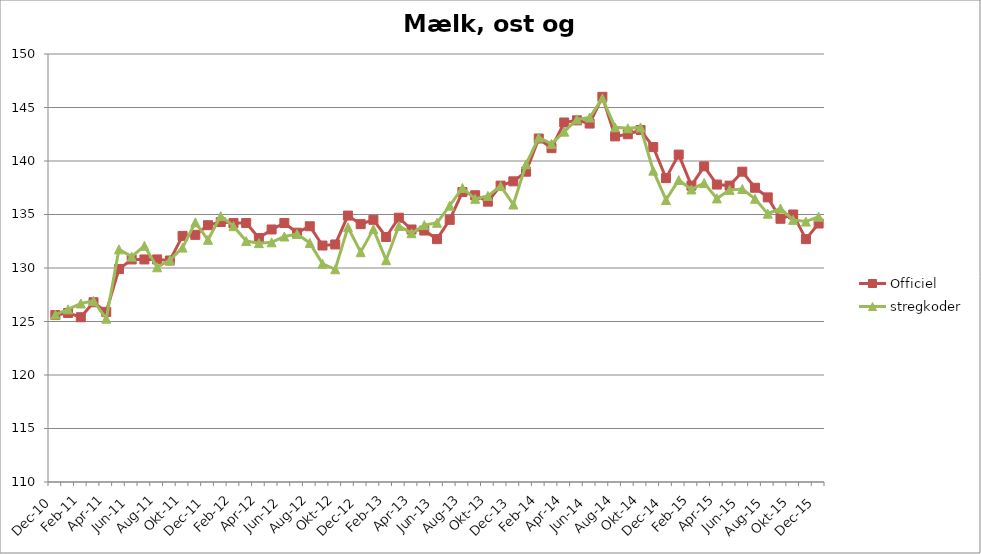
| Category | Officiel | stregkoder |
|---|---|---|
|  Dec-10 | 125.6 | 125.643 |
|  Jan-11 | 125.8 | 126.136 |
|  Feb-11 | 125.4 | 126.685 |
|  Mar-11 | 126.8 | 126.927 |
|  Apr-11 | 125.9 | 125.264 |
|  Maj-11 | 129.9 | 131.743 |
|  Jun-11 | 130.8 | 131.062 |
|  Jul-11 | 130.8 | 132.075 |
|  Aug-11 | 130.8 | 130.069 |
|  Sep-11 | 130.7 | 130.737 |
|  Okt-11 | 133 | 131.905 |
|  Nov-11 | 133.1 | 134.265 |
|  Dec-11 | 134 | 132.633 |
|  Jan-12 | 134.3 | 134.849 |
|  Feb-12 | 134.2 | 133.908 |
|  Mar-12 | 134.2 | 132.518 |
|  Apr-12 | 132.8 | 132.323 |
|  Maj-12 | 133.6 | 132.4 |
|  Jun-12 | 134.2 | 132.946 |
|  Jul-12 | 133.3 | 133.175 |
|  Aug-12 | 133.9 | 132.344 |
|  Sep-12 | 132.1 | 130.395 |
|  Okt-12 | 132.2 | 129.881 |
|  Nov-12 | 134.9 | 133.81 |
|  Dec-12 | 134.1 | 131.479 |
|  Jan-13 | 134.5 | 133.636 |
|  Feb-13 | 132.9 | 130.733 |
|  Mar-13 | 134.7 | 133.929 |
|  Apr-13 | 133.6 | 133.255 |
|  Maj-13 | 133.5 | 134.009 |
|  Jun-13 | 132.7 | 134.226 |
|  Jul-13 | 134.5 | 135.829 |
|  Aug-13 | 137.1 | 137.479 |
|  Sep-13 | 136.8 | 136.466 |
|  Okt-13 | 136.2 | 136.736 |
|  Nov-13 | 137.7 | 137.662 |
|  Dec-13 | 138.1 | 135.933 |
|  Jan-14 | 139 | 139.694 |
|  Feb-14 | 142.1 | 142.196 |
|  Mar-14 | 141.2 | 141.601 |
|  Apr-14 | 143.6 | 142.745 |
|  Maj-14 | 143.8 | 143.893 |
|  Jun-14 | 143.5 | 144.066 |
|  Jul-14 | 146 | 145.862 |
|  Aug-14 | 142.3 | 143.144 |
|  Sep-14 | 142.5 | 143.058 |
|  Okt-14 | 142.9 | 143.137 |
|  Nov-14 | 141.3 | 139.097 |
|  Dec-14 | 138.4 | 136.362 |
|  Jan-15 | 140.6 | 138.221 |
|  Feb-15 | 137.7 | 137.343 |
|  Mar-15 | 139.5 | 137.942 |
|  Apr-15 | 137.8 | 136.505 |
|  Maj-15 | 137.7 | 137.299 |
| Jun-15 | 139 | 137.384 |
| Jul-15 | 137.5 | 136.468 |
| Aug-15 | 136.6 | 135.078 |
| Sep-15 | 134.6 | 135.56 |
| Okt-15 | 135 | 134.498 |
| Nov-15 | 132.7 | 134.34 |
| Dec-15 | 134.159 | 134.796 |